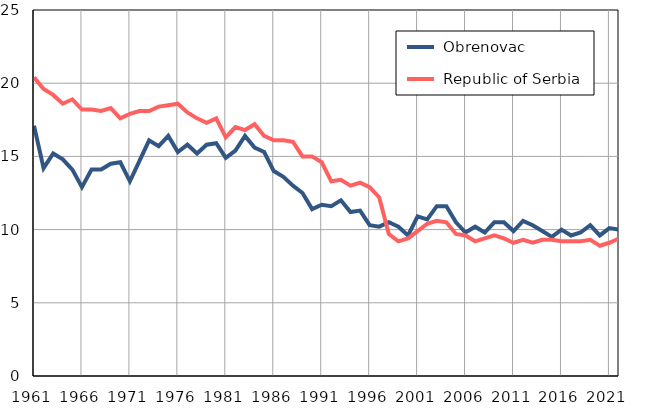
| Category |  Obrenovac |  Republic of Serbia |
|---|---|---|
| 1961.0 | 17.1 | 20.4 |
| 1962.0 | 14.2 | 19.6 |
| 1963.0 | 15.2 | 19.2 |
| 1964.0 | 14.8 | 18.6 |
| 1965.0 | 14.1 | 18.9 |
| 1966.0 | 12.9 | 18.2 |
| 1967.0 | 14.1 | 18.2 |
| 1968.0 | 14.1 | 18.1 |
| 1969.0 | 14.5 | 18.3 |
| 1970.0 | 14.6 | 17.6 |
| 1971.0 | 13.3 | 17.9 |
| 1972.0 | 14.7 | 18.1 |
| 1973.0 | 16.1 | 18.1 |
| 1974.0 | 15.7 | 18.4 |
| 1975.0 | 16.4 | 18.5 |
| 1976.0 | 15.3 | 18.6 |
| 1977.0 | 15.8 | 18 |
| 1978.0 | 15.2 | 17.6 |
| 1979.0 | 15.8 | 17.3 |
| 1980.0 | 15.9 | 17.6 |
| 1981.0 | 14.9 | 16.3 |
| 1982.0 | 15.4 | 17 |
| 1983.0 | 16.4 | 16.8 |
| 1984.0 | 15.6 | 17.2 |
| 1985.0 | 15.3 | 16.4 |
| 1986.0 | 14 | 16.1 |
| 1987.0 | 13.6 | 16.1 |
| 1988.0 | 13 | 16 |
| 1989.0 | 12.5 | 15 |
| 1990.0 | 11.4 | 15 |
| 1991.0 | 11.7 | 14.6 |
| 1992.0 | 11.6 | 13.3 |
| 1993.0 | 12 | 13.4 |
| 1994.0 | 11.2 | 13 |
| 1995.0 | 11.3 | 13.2 |
| 1996.0 | 10.3 | 12.9 |
| 1997.0 | 10.2 | 12.2 |
| 1998.0 | 10.5 | 9.7 |
| 1999.0 | 10.2 | 9.2 |
| 2000.0 | 9.6 | 9.4 |
| 2001.0 | 10.9 | 9.9 |
| 2002.0 | 10.7 | 10.4 |
| 2003.0 | 11.6 | 10.6 |
| 2004.0 | 11.6 | 10.5 |
| 2005.0 | 10.5 | 9.7 |
| 2006.0 | 9.8 | 9.6 |
| 2007.0 | 10.2 | 9.2 |
| 2008.0 | 9.8 | 9.4 |
| 2009.0 | 10.5 | 9.6 |
| 2010.0 | 10.5 | 9.4 |
| 2011.0 | 9.9 | 9.1 |
| 2012.0 | 10.6 | 9.3 |
| 2013.0 | 10.3 | 9.1 |
| 2014.0 | 9.9 | 9.3 |
| 2015.0 | 9.5 | 9.3 |
| 2016.0 | 10 | 9.2 |
| 2017.0 | 9.6 | 9.2 |
| 2018.0 | 9.8 | 9.2 |
| 2019.0 | 10.3 | 9.3 |
| 2020.0 | 9.6 | 8.9 |
| 2021.0 | 10.1 | 9.1 |
| 2022.0 | 10 | 9.4 |